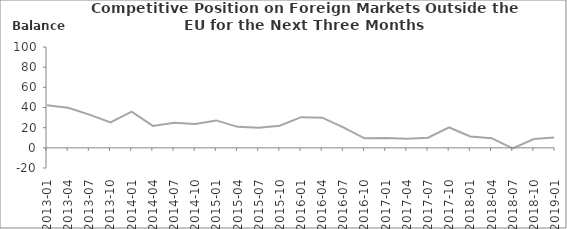
| Category | Balance |
|---|---|
| 2013-01 | 42.3 |
| 2013-04 | 39.7 |
| 2013-07 | 32.9 |
| 2013-10 | 25.2 |
| 2014-01 | 35.9 |
| 2014-04 | 21.7 |
| 2014-07 | 24.8 |
| 2014-10 | 23.7 |
| 2015-01 | 27.2 |
| 2015-04 | 20.8 |
| 2015-07 | 19.9 |
| 2015-10 | 22 |
| 2016-01 | 30.4 |
| 2016-04 | 29.9 |
| 2016-07 | 20.3 |
| 2016-10 | 9.4 |
| 2017-01 | 9.8 |
| 2017-04 | 8.9 |
| 2017-07 | 10.1 |
| 2017-10 | 20.2 |
| 2018-01 | 11.3 |
| 2018-04 | 9.6 |
| 2018-07 | -0.5 |
| 2018-10 | 8.7 |
| 2019-01 | 10.3 |